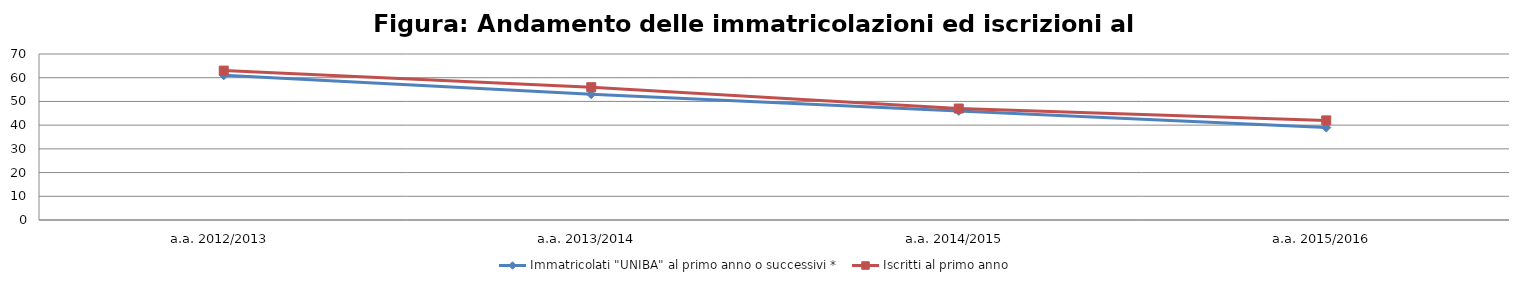
| Category | Immatricolati "UNIBA" al primo anno o successivi * | Iscritti al primo anno  |
|---|---|---|
| a.a. 2012/2013 | 61 | 63 |
| a.a. 2013/2014 | 53 | 56 |
| a.a. 2014/2015 | 46 | 47 |
| a.a. 2015/2016 | 39 | 42 |